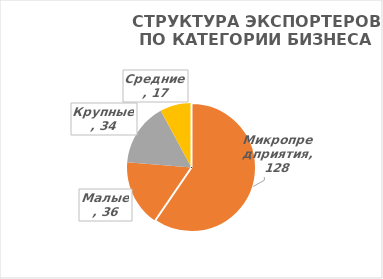
| Category | Итог |
|---|---|
| Микропредприятия | 128 |
| Малые | 36 |
| Крупные | 34 |
| Средние | 17 |